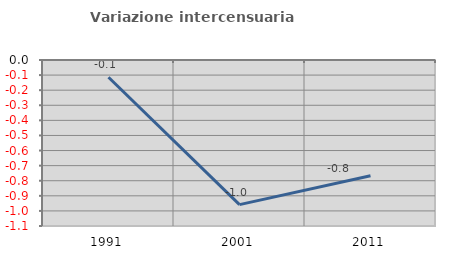
| Category | Variazione intercensuaria annua |
|---|---|
| 1991.0 | -0.114 |
| 2001.0 | -0.958 |
| 2011.0 | -0.767 |